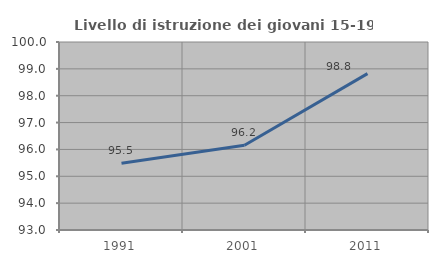
| Category | Livello di istruzione dei giovani 15-19 anni |
|---|---|
| 1991.0 | 95.489 |
| 2001.0 | 96.154 |
| 2011.0 | 98.824 |